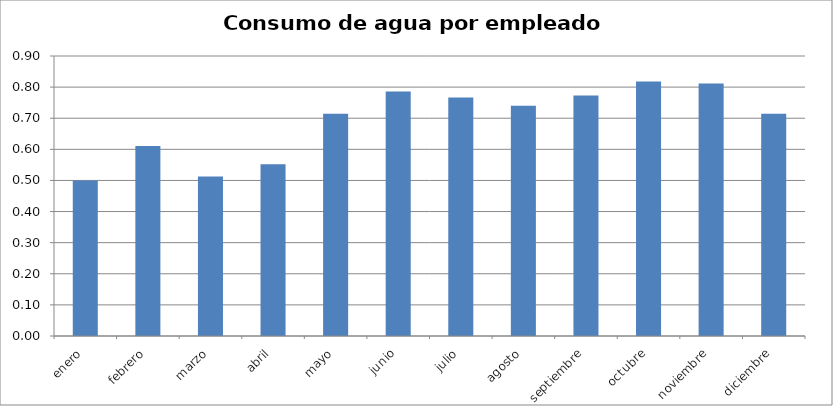
| Category | Series 0 |
|---|---|
| enero | 0.5 |
| febrero | 0.61 |
| marzo | 0.513 |
| abril | 0.552 |
| mayo | 0.714 |
| junio | 0.786 |
| julio | 0.766 |
| agosto | 0.74 |
| septiembre | 0.773 |
| octubre | 0.818 |
| noviembre | 0.812 |
| diciembre | 0.714 |